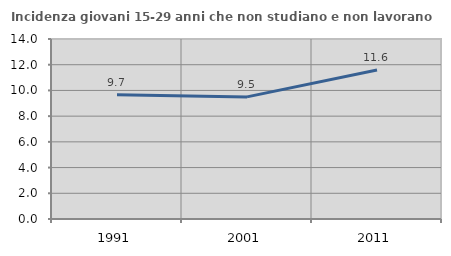
| Category | Incidenza giovani 15-29 anni che non studiano e non lavorano  |
|---|---|
| 1991.0 | 9.671 |
| 2001.0 | 9.497 |
| 2011.0 | 11.593 |